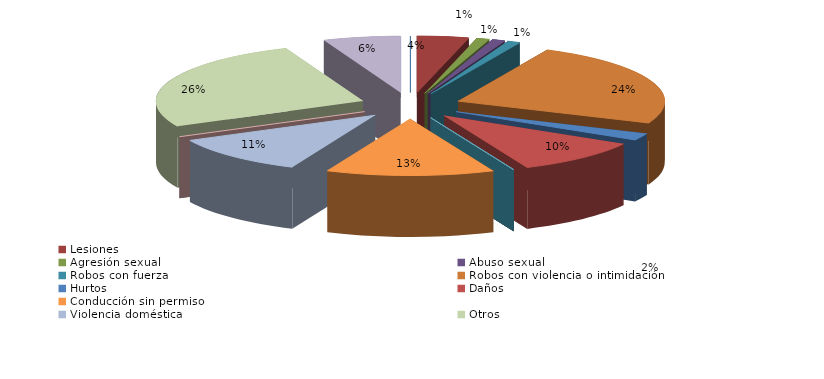
| Category | Series 0 |
|---|---|
| Homicidio/Asesinato dolosos | 0 |
| Lesiones | 4 |
| Agresión sexual | 1 |
| Abuso sexual | 1 |
| Robos con fuerza | 1 |
| Robos con violencia o intimidación | 24 |
| Hurtos | 2 |
| Daños | 10 |
| Contra la salud pública | 0 |
| Conduccción etílica/drogas | 0 |
| Conducción temeraria | 0 |
| Conducción sin permiso | 13 |
| Violencia doméstica | 11 |
| Violencia de género | 0 |
| Otros | 26 |
| Atentados y delitos de resistencia y desobediencia grave | 6 |
| Otros delitos contra el orden público | 0 |